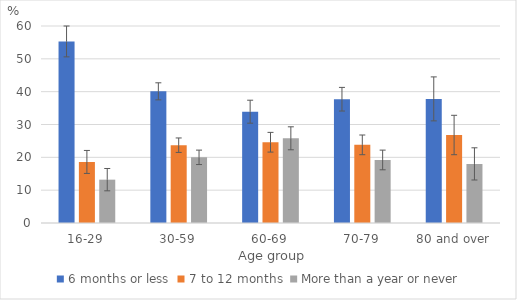
| Category | 6 months or less | 7 to 12 months | More than a year or never |
|---|---|---|---|
| 16-29 | 55.3 | 18.6 | 13.2 |
| 30-59 | 40.1 | 23.7 | 20 |
| 60-69 | 33.9 | 24.6 | 25.8 |
| 70-79 | 37.7 | 23.8 | 19.2 |
| 80 and over | 37.8 | 26.8 | 18 |